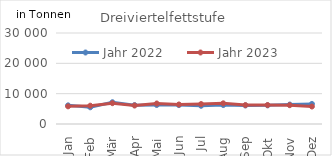
| Category | Jahr 2022 | Jahr 2023 |
|---|---|---|
| 0 | 6145.42 | 5821.782 |
| 1 | 5513.003 | 6033.574 |
| 2 | 7175.711 | 6861.629 |
| 3 | 6220.905 | 6100.301 |
| 4 | 6266.819 | 6758.741 |
| 5 | 6229.585 | 6435.648 |
| 6 | 6007.032 | 6571.034 |
| 7 | 6253.289 | 6813.164 |
| 8 | 6113.068 | 6225.292 |
| 9 | 6146.175 | 6246.251 |
| 10 | 6408.345 | 6205.239 |
| 11 | 6621.331 | 5768.942 |